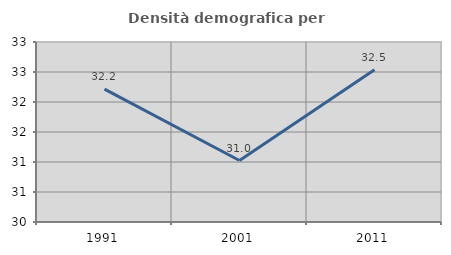
| Category | Densità demografica |
|---|---|
| 1991.0 | 32.213 |
| 2001.0 | 31.024 |
| 2011.0 | 32.538 |